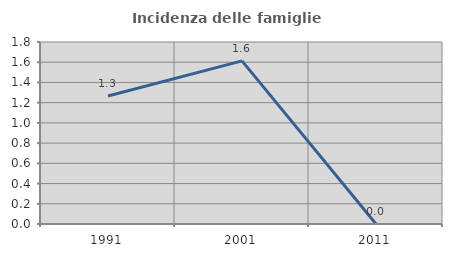
| Category | Incidenza delle famiglie numerose |
|---|---|
| 1991.0 | 1.266 |
| 2001.0 | 1.613 |
| 2011.0 | 0 |